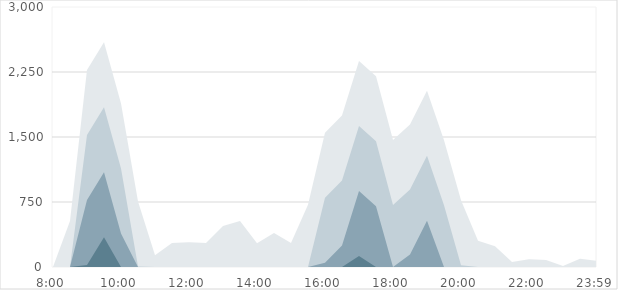
| Category | Продажи | Series 1 | Series 2 | Series 3 |
|---|---|---|---|---|
| 0.333333333333333 | 0 | 0 | 0 | 0 |
| nan | 532 | 0 | 0 | 0 |
| nan | 2273 | 1523 | 773 | 23 |
| nan | 2593 | 1843 | 1093 | 343 |
| 0.416666666666667 | 1887 | 1137 | 387 | 0 |
| nan | 755 | 5 | 0 | 0 |
| nan | 137 | 0 | 0 | 0 |
| nan | 276 | 0 | 0 | 0 |
| 0.5 | 287 | 0 | 0 | 0 |
| nan | 276 | 0 | 0 | 0 |
| nan | 472 | 0 | 0 | 0 |
| nan | 532 | 0 | 0 | 0 |
| 0.583333333333333 | 273 | 0 | 0 | 0 |
| nan | 393 | 0 | 0 | 0 |
| nan | 276 | 0 | 0 | 0 |
| nan | 718 | 0 | 0 | 0 |
| 0.666666666666667 | 1549 | 799 | 49 | 0 |
| nan | 1749 | 999 | 249 | 0 |
| nan | 2376 | 1626 | 876 | 126 |
| nan | 2200 | 1450 | 700 | 0 |
| 0.75 | 1465 | 715 | 0 | 0 |
| nan | 1643 | 893 | 143 | 0 |
| nan | 2035 | 1285 | 535 | 0 |
| nan | 1462 | 712 | 0 | 0 |
| 0.833333333333333 | 769 | 19 | 0 | 0 |
| nan | 303 | 0 | 0 | 0 |
| nan | 238 | 0 | 0 | 0 |
| nan | 59 | 0 | 0 | 0 |
| 0.916666666666667 | 90 | 0 | 0 | 0 |
| nan | 80 | 0 | 0 | 0 |
| nan | 11 | 0 | 0 | 0 |
| nan | 96 | 0 | 0 | 0 |
| 0.9993055555555556 | 71 | 0 | 0 | 0 |